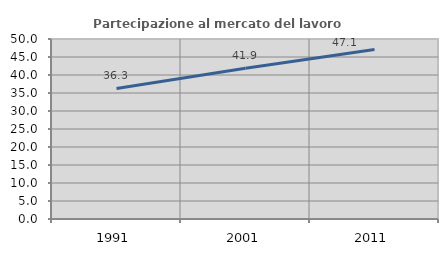
| Category | Partecipazione al mercato del lavoro  femminile |
|---|---|
| 1991.0 | 36.261 |
| 2001.0 | 41.857 |
| 2011.0 | 47.086 |